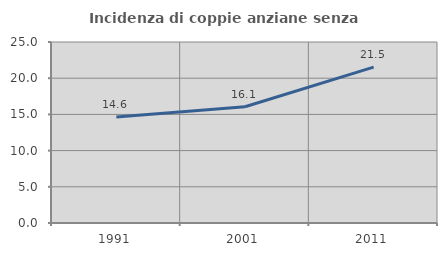
| Category | Incidenza di coppie anziane senza figli  |
|---|---|
| 1991.0 | 14.643 |
| 2001.0 | 16.057 |
| 2011.0 | 21.531 |